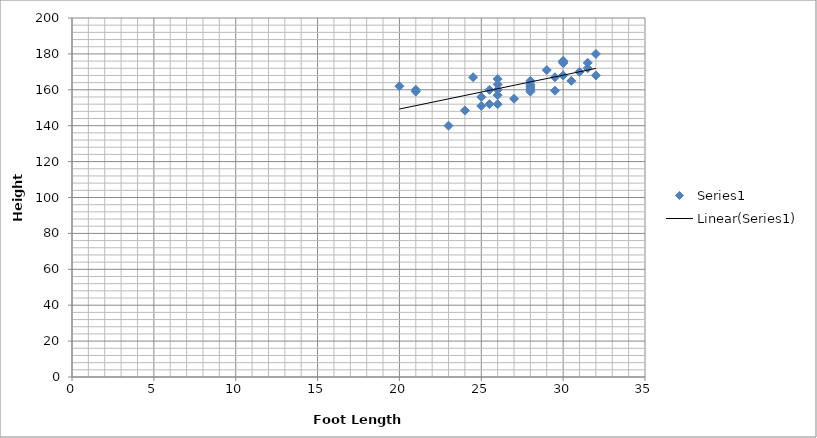
| Category | Series 0 |
|---|---|
| 30.5 | 165 |
| 30.0 | 176 |
| 23.0 | 140 |
| 28.0 | 165 |
| 28.0 | 163 |
| 25.0 | 156 |
| 30.0 | 175 |
| 25.5 | 152 |
| 32.0 | 168 |
| 32.0 | 180 |
| 28.0 | 159 |
| 21.0 | 159 |
| 26.0 | 163 |
| 25.0 | 151 |
| 20.0 | 162 |
| 28.0 | 161 |
| 26.0 | 166 |
| 30.0 | 168 |
| 26.0 | 160 |
| 30.0 | 175 |
| 21.0 | 160 |
| 24.5 | 167 |
| 25.5 | 160 |
| 31.0 | 170 |
| 31.5 | 172 |
| 27.0 | 155 |
| 30.0 | 176 |
| 31.5 | 175 |
| 24.0 | 148.5 |
| 26.0 | 157 |
| 28.0 | 160 |
| 28.0 | 162 |
| 29.5 | 159.5 |
| 29.5 | 167 |
| 26.0 | 152 |
| 29.0 | 171 |